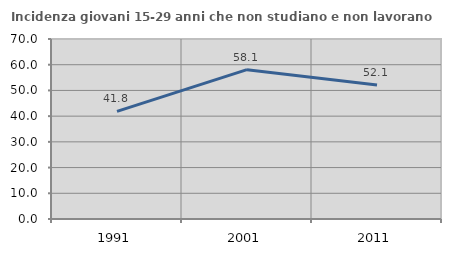
| Category | Incidenza giovani 15-29 anni che non studiano e non lavorano  |
|---|---|
| 1991.0 | 41.828 |
| 2001.0 | 58.085 |
| 2011.0 | 52.128 |